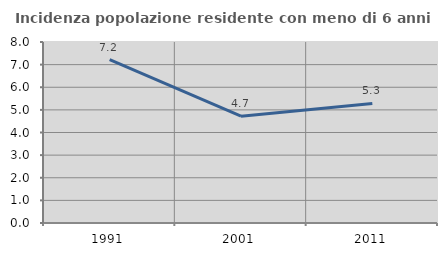
| Category | Incidenza popolazione residente con meno di 6 anni |
|---|---|
| 1991.0 | 7.221 |
| 2001.0 | 4.72 |
| 2011.0 | 5.284 |